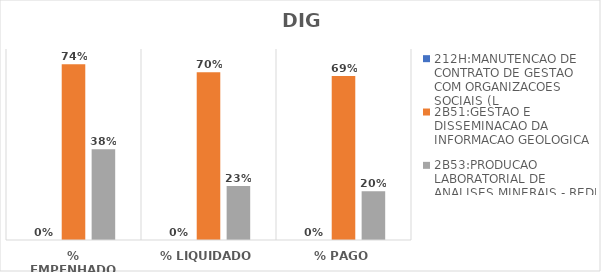
| Category | 212H:MANUTENCAO DE CONTRATO DE GESTAO COM ORGANIZACOES SOCIAIS (L | 2B51:GESTAO E DISSEMINACAO DA INFORMACAO GEOLOGICA | 2B53:PRODUCAO LABORATORIAL DE ANALISES MINERAIS - REDE LAMIN |
|---|---|---|---|
| % EMPENHADO | 0 | 0.736 | 0.38 |
| % LIQUIDADO | 0 | 0.703 | 0.226 |
| % PAGO | 0 | 0.687 | 0.205 |